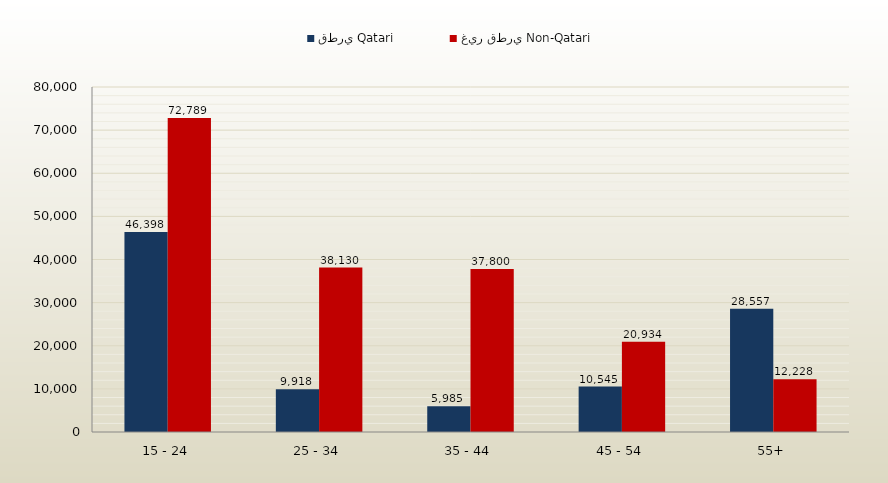
| Category | قطري Qatari | غير قطري Non-Qatari |
|---|---|---|
| 15 - 24 | 46398 | 72789 |
| 25 - 34 | 9918 | 38130 |
| 35 - 44 | 5985 | 37800 |
| 45 - 54 | 10545 | 20934 |
| 55+ | 28557 | 12228 |